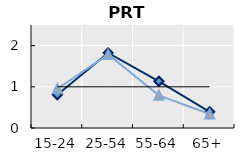
| Category | Foreign-born | Native-born | Series 1 |
|---|---|---|---|
| 15-24 | 0.807 | 0.953 | 1 |
| 25-54 | 1.823 | 1.782 | 1 |
| 55-64 | 1.134 | 0.793 | 1 |
| 65+ | 0.394 | 0.34 | 1 |